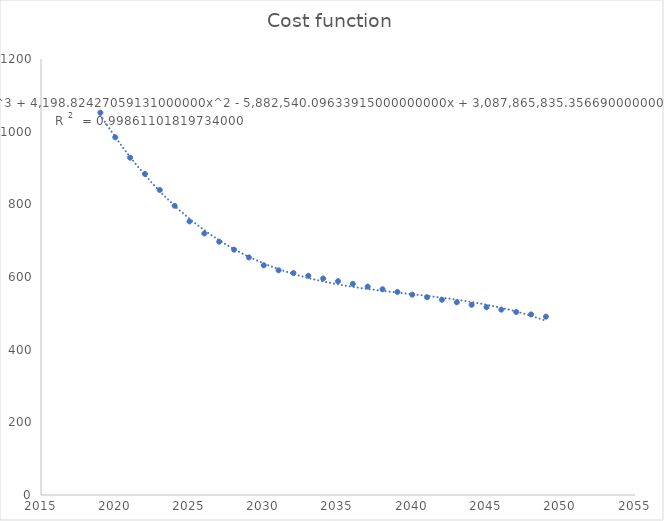
| Category | Series 0 |
|---|---|
| 2019.0 | 1052.416 |
| 2020.0 | 984.427 |
| 2021.0 | 928.332 |
| 2022.0 | 883.59 |
| 2023.0 | 839.525 |
| 2024.0 | 795.951 |
| 2025.0 | 752.95 |
| 2026.0 | 719.804 |
| 2027.0 | 697.135 |
| 2028.0 | 675.19 |
| 2029.0 | 653.913 |
| 2030.0 | 632.211 |
| 2031.0 | 618.285 |
| 2032.0 | 610.857 |
| 2033.0 | 603.397 |
| 2034.0 | 595.903 |
| 2035.0 | 588.476 |
| 2036.0 | 581.049 |
| 2037.0 | 573.608 |
| 2038.0 | 566.288 |
| 2039.0 | 558.897 |
| 2040.0 | 551.412 |
| 2041.0 | 544.329 |
| 2042.0 | 537.288 |
| 2043.0 | 530.361 |
| 2044.0 | 523.522 |
| 2045.0 | 516.744 |
| 2046.0 | 510.102 |
| 2047.0 | 503.569 |
| 2048.0 | 497.091 |
| 2049.0 | 490.807 |